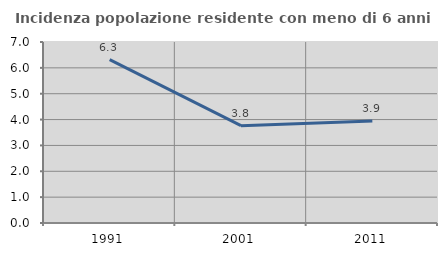
| Category | Incidenza popolazione residente con meno di 6 anni |
|---|---|
| 1991.0 | 6.32 |
| 2001.0 | 3.764 |
| 2011.0 | 3.947 |